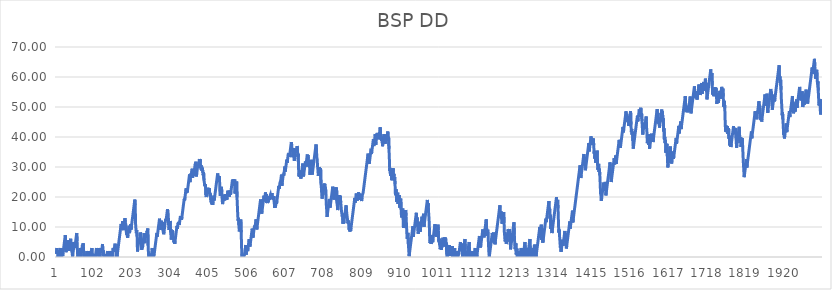
| Category | BSP DD |
|---|---|
| 0 | 1 |
| 1 | 2 |
| 2 | 3 |
| 3 | 1.15 |
| 4 | 2.15 |
| 5 | 0 |
| 6 | 0 |
| 7 | 1 |
| 8 | 0 |
| 9 | 1 |
| 10 | 2 |
| 11 | 3 |
| 12 | 1.41 |
| 13 | 0 |
| 14 | 1 |
| 15 | 2 |
| 16 | 3 |
| 17 | 0.31 |
| 18 | 1.31 |
| 19 | 2.31 |
| 20 | 3.31 |
| 21 | 4.31 |
| 22 | 5.31 |
| 23 | 6.31 |
| 24 | 7.31 |
| 25 | 4.64 |
| 26 | 1.6 |
| 27 | 2.6 |
| 28 | 3.6 |
| 29 | 4.6 |
| 30 | 5.6 |
| 31 | 4.37 |
| 32 | 2.92 |
| 33 | 3.92 |
| 34 | 2.1 |
| 35 | 3.1 |
| 36 | 4.1 |
| 37 | 5.1 |
| 38 | 6.1 |
| 39 | 2.9 |
| 40 | 3.9 |
| 41 | 4.9 |
| 42 | 1.47 |
| 43 | 0 |
| 44 | 1 |
| 45 | 2 |
| 46 | 3 |
| 47 | 4 |
| 48 | 5 |
| 49 | 3 |
| 50 | 4 |
| 51 | 5 |
| 52 | 6 |
| 53 | 7 |
| 54 | 8 |
| 55 | 5.35 |
| 56 | 1.64 |
| 57 | 0.07 |
| 58 | 1.07 |
| 59 | 2.07 |
| 60 | 0 |
| 61 | 1 |
| 62 | 2 |
| 63 | 3 |
| 64 | 1.67 |
| 65 | 0 |
| 66 | 1 |
| 67 | 2 |
| 68 | 3 |
| 69 | 4 |
| 70 | 3.55 |
| 71 | 4.55 |
| 72 | 2.29 |
| 73 | 0 |
| 74 | 0 |
| 75 | 0 |
| 76 | 0 |
| 77 | 1 |
| 78 | 0 |
| 79 | 0 |
| 80 | 1 |
| 81 | 2 |
| 82 | 0 |
| 83 | 0 |
| 84 | 1 |
| 85 | 2 |
| 86 | 0.72 |
| 87 | 0 |
| 88 | 0 |
| 89 | 1 |
| 90 | 0 |
| 91 | 0 |
| 92 | 1 |
| 93 | 2 |
| 94 | 3 |
| 95 | 0 |
| 96 | 0 |
| 97 | 0 |
| 98 | 0 |
| 99 | 0 |
| 100 | 1 |
| 101 | 0 |
| 102 | 1 |
| 103 | 0 |
| 104 | 1 |
| 105 | 2 |
| 106 | 3 |
| 107 | 1.53 |
| 108 | 0.18 |
| 109 | 0 |
| 110 | 1 |
| 111 | 2 |
| 112 | 3 |
| 113 | 0.79 |
| 114 | 1.79 |
| 115 | 0 |
| 116 | 1 |
| 117 | 2 |
| 118 | 3 |
| 119 | 1.33 |
| 120 | 2.33 |
| 121 | 3.33 |
| 122 | 4.33 |
| 123 | 1.19 |
| 124 | 2.19 |
| 125 | 0.24 |
| 126 | 0 |
| 127 | 0 |
| 128 | 0 |
| 129 | 0 |
| 130 | 1 |
| 131 | 0 |
| 132 | 1 |
| 133 | 0 |
| 134 | 1 |
| 135 | 2 |
| 136 | 0.4 |
| 137 | 0 |
| 138 | 0 |
| 139 | 1 |
| 140 | 0 |
| 141 | 1 |
| 142 | 2 |
| 143 | 0 |
| 144 | 0 |
| 145 | 1 |
| 146 | 2 |
| 147 | 0 |
| 148 | 1 |
| 149 | 2 |
| 150 | 3 |
| 151 | 1.76 |
| 152 | 2.76 |
| 153 | 2.44 |
| 154 | 3.44 |
| 155 | 4.44 |
| 156 | 3.15 |
| 157 | 1.98 |
| 158 | 0.03 |
| 159 | 1.03 |
| 160 | 0 |
| 161 | 1 |
| 162 | 2 |
| 163 | 3 |
| 164 | 4 |
| 165 | 5 |
| 166 | 6 |
| 167 | 7 |
| 168 | 8 |
| 169 | 9 |
| 170 | 10 |
| 171 | 11 |
| 172 | 8.97 |
| 173 | 9.97 |
| 174 | 10.97 |
| 175 | 11.97 |
| 176 | 9.91 |
| 177 | 8.95 |
| 178 | 9.95 |
| 179 | 10.95 |
| 180 | 11.95 |
| 181 | 12.95 |
| 182 | 11.55 |
| 183 | 11.25 |
| 184 | 10.39 |
| 185 | 7.46 |
| 186 | 8.46 |
| 187 | 7.21 |
| 188 | 6.42 |
| 189 | 7.42 |
| 190 | 8.42 |
| 191 | 9.42 |
| 192 | 10.42 |
| 193 | 7.97 |
| 194 | 8.97 |
| 195 | 9.97 |
| 196 | 10.97 |
| 197 | 9.13 |
| 198 | 10.13 |
| 199 | 11.13 |
| 200 | 12.13 |
| 201 | 13.13 |
| 202 | 14.13 |
| 203 | 15.13 |
| 204 | 16.13 |
| 205 | 17.13 |
| 206 | 18.13 |
| 207 | 19.13 |
| 208 | 17.41 |
| 209 | 11.03 |
| 210 | 9.23 |
| 211 | 7.93 |
| 212 | 8.93 |
| 213 | 6.92 |
| 214 | 1.82 |
| 215 | 2.82 |
| 216 | 3.82 |
| 217 | 4.82 |
| 218 | 5.82 |
| 219 | 5.17 |
| 220 | 6.17 |
| 221 | 7.17 |
| 222 | 8.17 |
| 223 | 7.64 |
| 224 | 5.45 |
| 225 | 2.36 |
| 226 | 3.36 |
| 227 | 2.93 |
| 228 | 3.93 |
| 229 | 4.93 |
| 230 | 5.93 |
| 231 | 6.93 |
| 232 | 7.93 |
| 233 | 4.62 |
| 234 | 5.62 |
| 235 | 6.62 |
| 236 | 7.62 |
| 237 | 6.81 |
| 238 | 7.81 |
| 239 | 8.81 |
| 240 | 8.47 |
| 241 | 9.47 |
| 242 | 3.83 |
| 243 | 0.92 |
| 244 | 0 |
| 245 | 0 |
| 246 | 1 |
| 247 | 0 |
| 248 | 0 |
| 249 | 1 |
| 250 | 0 |
| 251 | 1 |
| 252 | 2 |
| 253 | 3 |
| 254 | 0 |
| 255 | 1 |
| 256 | 0 |
| 257 | 0 |
| 258 | 1 |
| 259 | 2 |
| 260 | 3 |
| 261 | 4 |
| 262 | 5 |
| 263 | 6 |
| 264 | 7 |
| 265 | 8 |
| 266 | 6.77 |
| 267 | 7.77 |
| 268 | 8.77 |
| 269 | 9.77 |
| 270 | 10.77 |
| 271 | 11.77 |
| 272 | 12.77 |
| 273 | 11.6 |
| 274 | 9.1 |
| 275 | 10.1 |
| 276 | 11.1 |
| 277 | 12.1 |
| 278 | 9.65 |
| 279 | 10.65 |
| 280 | 11.65 |
| 281 | 8.96 |
| 282 | 8.63 |
| 283 | 7.58 |
| 284 | 8.58 |
| 285 | 9.58 |
| 286 | 10.58 |
| 287 | 11.58 |
| 288 | 12.58 |
| 289 | 11.96 |
| 290 | 12.96 |
| 291 | 13.96 |
| 292 | 14.96 |
| 293 | 15.96 |
| 294 | 15.05 |
| 295 | 14.23 |
| 296 | 10.53 |
| 297 | 9.03 |
| 298 | 10.03 |
| 299 | 11.03 |
| 300 | 12.03 |
| 301 | 8.26 |
| 302 | 9.26 |
| 303 | 5.83 |
| 304 | 6.83 |
| 305 | 7.83 |
| 306 | 8.83 |
| 307 | 8.36 |
| 308 | 6.65 |
| 309 | 5.85 |
| 310 | 4.83 |
| 311 | 5.83 |
| 312 | 4.38 |
| 313 | 5.38 |
| 314 | 6.38 |
| 315 | 7.38 |
| 316 | 8.38 |
| 317 | 9.38 |
| 318 | 10.38 |
| 319 | 9.44 |
| 320 | 10.44 |
| 321 | 11.44 |
| 322 | 10.73 |
| 323 | 11.73 |
| 324 | 10.68 |
| 325 | 11.68 |
| 326 | 12.68 |
| 327 | 13.68 |
| 328 | 12.53 |
| 329 | 13.53 |
| 330 | 12.38 |
| 331 | 13.38 |
| 332 | 14.38 |
| 333 | 15.38 |
| 334 | 16.38 |
| 335 | 17.38 |
| 336 | 18.38 |
| 337 | 19.38 |
| 338 | 18.89 |
| 339 | 19.89 |
| 340 | 20.89 |
| 341 | 21.89 |
| 342 | 22.89 |
| 343 | 21.32 |
| 344 | 22.32 |
| 345 | 21.51 |
| 346 | 22.51 |
| 347 | 23.51 |
| 348 | 24.51 |
| 349 | 25.51 |
| 350 | 26.51 |
| 351 | 27.51 |
| 352 | 24.96 |
| 353 | 25.96 |
| 354 | 26.96 |
| 355 | 27.96 |
| 356 | 27.45 |
| 357 | 28.45 |
| 358 | 29.45 |
| 359 | 26.42 |
| 360 | 27.42 |
| 361 | 28.42 |
| 362 | 27.15 |
| 363 | 28.15 |
| 364 | 29.15 |
| 365 | 30.15 |
| 366 | 31.15 |
| 367 | 30.74 |
| 368 | 31.74 |
| 369 | 26.87 |
| 370 | 27.87 |
| 371 | 28.87 |
| 372 | 29.87 |
| 373 | 30.87 |
| 374 | 29.67 |
| 375 | 30.67 |
| 376 | 31.67 |
| 377 | 32.67 |
| 378 | 31.58 |
| 379 | 32.58 |
| 380 | 29.61 |
| 381 | 30.61 |
| 382 | 29.1 |
| 383 | 30.1 |
| 384 | 28.73 |
| 385 | 29.73 |
| 386 | 28.15 |
| 387 | 27.2 |
| 388 | 28.2 |
| 389 | 25.57 |
| 390 | 24.84 |
| 391 | 23.55 |
| 392 | 23.26 |
| 393 | 24.26 |
| 394 | 20.71 |
| 395 | 19.99 |
| 396 | 20.99 |
| 397 | 21.99 |
| 398 | 22.99 |
| 399 | 22.06 |
| 400 | 23.06 |
| 401 | 20.97 |
| 402 | 21.97 |
| 403 | 22.97 |
| 404 | 21.54 |
| 405 | 20.17 |
| 406 | 21.17 |
| 407 | 18.99 |
| 408 | 18.18 |
| 409 | 19.18 |
| 410 | 17.52 |
| 411 | 18.52 |
| 412 | 17.42 |
| 413 | 18.42 |
| 414 | 19.42 |
| 415 | 20.42 |
| 416 | 18.86 |
| 417 | 19.86 |
| 418 | 20.86 |
| 419 | 21.86 |
| 420 | 22.86 |
| 421 | 23.86 |
| 422 | 24.86 |
| 423 | 25.86 |
| 424 | 26.86 |
| 425 | 27.86 |
| 426 | 26.02 |
| 427 | 27.02 |
| 428 | 25.98 |
| 429 | 26.98 |
| 430 | 25.92 |
| 431 | 21.31 |
| 432 | 20.41 |
| 433 | 21.41 |
| 434 | 22.41 |
| 435 | 23.41 |
| 436 | 21.52 |
| 437 | 18.97 |
| 438 | 17.63 |
| 439 | 18.63 |
| 440 | 19.63 |
| 441 | 18.77 |
| 442 | 19.77 |
| 443 | 20.77 |
| 444 | 18.93 |
| 445 | 19.93 |
| 446 | 20.93 |
| 447 | 19.36 |
| 448 | 20.36 |
| 449 | 19.09 |
| 450 | 20.09 |
| 451 | 21.09 |
| 452 | 22.09 |
| 453 | 20.11 |
| 454 | 21.11 |
| 455 | 22.11 |
| 456 | 20.13 |
| 457 | 21.13 |
| 458 | 22.13 |
| 459 | 20.78 |
| 460 | 21.78 |
| 461 | 22.78 |
| 462 | 23.78 |
| 463 | 24.78 |
| 464 | 25.78 |
| 465 | 23.83 |
| 466 | 24.83 |
| 467 | 25.83 |
| 468 | 23.86 |
| 469 | 24.86 |
| 470 | 25.86 |
| 471 | 21.18 |
| 472 | 22.18 |
| 473 | 23.18 |
| 474 | 24.18 |
| 475 | 25.18 |
| 476 | 19.91 |
| 477 | 16.87 |
| 478 | 13.73 |
| 479 | 12.03 |
| 480 | 13.03 |
| 481 | 10.53 |
| 482 | 8.52 |
| 483 | 9.52 |
| 484 | 10.52 |
| 485 | 11.52 |
| 486 | 12.52 |
| 487 | 8.21 |
| 488 | 3.31 |
| 489 | 0 |
| 490 | 1 |
| 491 | 0 |
| 492 | 1 |
| 493 | 0 |
| 494 | 0 |
| 495 | 0 |
| 496 | 1 |
| 497 | 2 |
| 498 | 3 |
| 499 | 4 |
| 500 | 0.82 |
| 501 | 1.82 |
| 502 | 2.82 |
| 503 | 3.82 |
| 504 | 1.96 |
| 505 | 2.96 |
| 506 | 3.96 |
| 507 | 4.96 |
| 508 | 5.96 |
| 509 | 4.14 |
| 510 | 3.47 |
| 511 | 4.47 |
| 512 | 5.47 |
| 513 | 6.47 |
| 514 | 7.47 |
| 515 | 8.47 |
| 516 | 9.47 |
| 517 | 8.38 |
| 518 | 6.44 |
| 519 | 7.44 |
| 520 | 8.44 |
| 521 | 9.44 |
| 522 | 10.44 |
| 523 | 9.56 |
| 524 | 10.56 |
| 525 | 11.56 |
| 526 | 12.56 |
| 527 | 11.75 |
| 528 | 9.18 |
| 529 | 10.18 |
| 530 | 11.18 |
| 531 | 12.18 |
| 532 | 13.18 |
| 533 | 14.18 |
| 534 | 15.18 |
| 535 | 16.18 |
| 536 | 17.18 |
| 537 | 18.18 |
| 538 | 19.18 |
| 539 | 17.94 |
| 540 | 15.11 |
| 541 | 14.44 |
| 542 | 15.44 |
| 543 | 16.44 |
| 544 | 17.44 |
| 545 | 18.44 |
| 546 | 19.44 |
| 547 | 20.44 |
| 548 | 18.55 |
| 549 | 19.55 |
| 550 | 20.55 |
| 551 | 21.55 |
| 552 | 20.01 |
| 553 | 21.01 |
| 554 | 18.07 |
| 555 | 19.07 |
| 556 | 17.97 |
| 557 | 18.97 |
| 558 | 18.24 |
| 559 | 19.24 |
| 560 | 20.24 |
| 561 | 19.01 |
| 562 | 20.01 |
| 563 | 19.74 |
| 564 | 20.74 |
| 565 | 20.1 |
| 566 | 21.1 |
| 567 | 20.28 |
| 568 | 21.28 |
| 569 | 19.24 |
| 570 | 20.24 |
| 571 | 20.05 |
| 572 | 19.24 |
| 573 | 20.24 |
| 574 | 18.32 |
| 575 | 16.35 |
| 576 | 17.35 |
| 577 | 16.53 |
| 578 | 17.53 |
| 579 | 18.53 |
| 580 | 17.69 |
| 581 | 18.69 |
| 582 | 19.69 |
| 583 | 20.69 |
| 584 | 21.69 |
| 585 | 22.69 |
| 586 | 23.69 |
| 587 | 22.69 |
| 588 | 23.69 |
| 589 | 24.69 |
| 590 | 24.46 |
| 591 | 25.46 |
| 592 | 26.46 |
| 593 | 27.46 |
| 594 | 23.74 |
| 595 | 24.74 |
| 596 | 25.74 |
| 597 | 26.74 |
| 598 | 27.74 |
| 599 | 27.16 |
| 600 | 28.16 |
| 601 | 29.16 |
| 602 | 30.16 |
| 603 | 28.45 |
| 604 | 29.45 |
| 605 | 30.45 |
| 606 | 31.45 |
| 607 | 32.45 |
| 608 | 31.4 |
| 609 | 32.4 |
| 610 | 33.4 |
| 611 | 34.4 |
| 612 | 33.67 |
| 613 | 34.67 |
| 614 | 33.32 |
| 615 | 34.32 |
| 616 | 35.32 |
| 617 | 36.32 |
| 618 | 37.32 |
| 619 | 38.32 |
| 620 | 37.32 |
| 621 | 35.32 |
| 622 | 36.32 |
| 623 | 33.28 |
| 624 | 34.28 |
| 625 | 35.28 |
| 626 | 36.28 |
| 627 | 32.07 |
| 628 | 33.07 |
| 629 | 34.07 |
| 630 | 35.07 |
| 631 | 36.07 |
| 632 | 34.95 |
| 633 | 35.95 |
| 634 | 36.95 |
| 635 | 36.46 |
| 636 | 33.43 |
| 637 | 34.43 |
| 638 | 29.54 |
| 639 | 26.85 |
| 640 | 27.85 |
| 641 | 26.8 |
| 642 | 27.8 |
| 643 | 28.8 |
| 644 | 26.15 |
| 645 | 27.15 |
| 646 | 28.15 |
| 647 | 29.15 |
| 648 | 30.15 |
| 649 | 31.15 |
| 650 | 28.11 |
| 651 | 26.84 |
| 652 | 27.84 |
| 653 | 28.84 |
| 654 | 29.84 |
| 655 | 30.84 |
| 656 | 31.84 |
| 657 | 30.17 |
| 658 | 31.17 |
| 659 | 32.17 |
| 660 | 33.17 |
| 661 | 34.17 |
| 662 | 32.98 |
| 663 | 33.98 |
| 664 | 30.2 |
| 665 | 31.2 |
| 666 | 32.2 |
| 667 | 30.1 |
| 668 | 27.39 |
| 669 | 28.39 |
| 670 | 29.39 |
| 671 | 30.39 |
| 672 | 31.39 |
| 673 | 32.39 |
| 674 | 27.51 |
| 675 | 28.51 |
| 676 | 29.51 |
| 677 | 30.51 |
| 678 | 31.51 |
| 679 | 32.51 |
| 680 | 33.51 |
| 681 | 34.51 |
| 682 | 35.51 |
| 683 | 36.51 |
| 684 | 37.51 |
| 685 | 36.19 |
| 686 | 33.19 |
| 687 | 32.66 |
| 688 | 30.24 |
| 689 | 28.98 |
| 690 | 27.02 |
| 691 | 28.02 |
| 692 | 29.02 |
| 693 | 30.02 |
| 694 | 27.66 |
| 695 | 28.66 |
| 696 | 29.66 |
| 697 | 24.49 |
| 698 | 23.19 |
| 699 | 20.89 |
| 700 | 19.45 |
| 701 | 20.45 |
| 702 | 21.45 |
| 703 | 22.45 |
| 704 | 23.45 |
| 705 | 24.45 |
| 706 | 23.4 |
| 707 | 24.4 |
| 708 | 22.15 |
| 709 | 23.15 |
| 710 | 20.55 |
| 711 | 17.66 |
| 712 | 15.72 |
| 713 | 13.37 |
| 714 | 14.37 |
| 715 | 15.37 |
| 716 | 16.37 |
| 717 | 17.37 |
| 718 | 18.37 |
| 719 | 19.37 |
| 720 | 17.7 |
| 721 | 16.45 |
| 722 | 17.45 |
| 723 | 18.45 |
| 724 | 19.45 |
| 725 | 20.45 |
| 726 | 21.45 |
| 727 | 22.45 |
| 728 | 23.45 |
| 729 | 20.51 |
| 730 | 21.51 |
| 731 | 19.16 |
| 732 | 20.16 |
| 733 | 21.16 |
| 734 | 22.16 |
| 735 | 23.16 |
| 736 | 21.17 |
| 737 | 22.17 |
| 738 | 23.17 |
| 739 | 18.07 |
| 740 | 17.19 |
| 741 | 15.64 |
| 742 | 16.64 |
| 743 | 17.64 |
| 744 | 18.64 |
| 745 | 19.64 |
| 746 | 20.64 |
| 747 | 19.41 |
| 748 | 20.41 |
| 749 | 18.16 |
| 750 | 16.78 |
| 751 | 15.31 |
| 752 | 15.06 |
| 753 | 13.47 |
| 754 | 14.47 |
| 755 | 11.13 |
| 756 | 12.13 |
| 757 | 11.23 |
| 758 | 12.23 |
| 759 | 13.23 |
| 760 | 14.23 |
| 761 | 15.23 |
| 762 | 16.23 |
| 763 | 17.23 |
| 764 | 15.86 |
| 765 | 14.39 |
| 766 | 13.37 |
| 767 | 12.33 |
| 768 | 11.17 |
| 769 | 12.17 |
| 770 | 10.92 |
| 771 | 9.08 |
| 772 | 10.08 |
| 773 | 8.5 |
| 774 | 9.5 |
| 775 | 8.67 |
| 776 | 9.67 |
| 777 | 10.67 |
| 778 | 11.67 |
| 779 | 12.67 |
| 780 | 13.67 |
| 781 | 14.67 |
| 782 | 15.67 |
| 783 | 16.67 |
| 784 | 17.67 |
| 785 | 18.67 |
| 786 | 19.67 |
| 787 | 18.16 |
| 788 | 19.16 |
| 789 | 20.16 |
| 790 | 21.16 |
| 791 | 19.75 |
| 792 | 18.73 |
| 793 | 19.73 |
| 794 | 19.57 |
| 795 | 20.57 |
| 796 | 21.57 |
| 797 | 20.13 |
| 798 | 21.13 |
| 799 | 19.02 |
| 800 | 20.02 |
| 801 | 21.02 |
| 802 | 19.6 |
| 803 | 20.6 |
| 804 | 18.65 |
| 805 | 19.65 |
| 806 | 20.65 |
| 807 | 20.46 |
| 808 | 21.46 |
| 809 | 22.46 |
| 810 | 23.46 |
| 811 | 24.46 |
| 812 | 25.46 |
| 813 | 26.46 |
| 814 | 27.46 |
| 815 | 28.46 |
| 816 | 29.46 |
| 817 | 30.46 |
| 818 | 31.46 |
| 819 | 32.46 |
| 820 | 33.46 |
| 821 | 34.46 |
| 822 | 32.93 |
| 823 | 32.05 |
| 824 | 31.08 |
| 825 | 32.08 |
| 826 | 33.08 |
| 827 | 34.08 |
| 828 | 35.08 |
| 829 | 36.08 |
| 830 | 34.34 |
| 831 | 35.34 |
| 832 | 36.34 |
| 833 | 37.34 |
| 834 | 38.34 |
| 835 | 39.34 |
| 836 | 36.99 |
| 837 | 37.99 |
| 838 | 38.99 |
| 839 | 39.99 |
| 840 | 40.99 |
| 841 | 37.36 |
| 842 | 38.36 |
| 843 | 39.36 |
| 844 | 40.36 |
| 845 | 41.36 |
| 846 | 40.43 |
| 847 | 40.26 |
| 848 | 41.26 |
| 849 | 39.25 |
| 850 | 40.25 |
| 851 | 41.25 |
| 852 | 42.25 |
| 853 | 43.25 |
| 854 | 40.97 |
| 855 | 39.17 |
| 856 | 40.17 |
| 857 | 38.73 |
| 858 | 39.73 |
| 859 | 36.94 |
| 860 | 37.94 |
| 861 | 38.94 |
| 862 | 39.94 |
| 863 | 40.94 |
| 864 | 39.04 |
| 865 | 40.04 |
| 866 | 37.78 |
| 867 | 38.78 |
| 868 | 39.78 |
| 869 | 40.78 |
| 870 | 38.83 |
| 871 | 39.83 |
| 872 | 40.83 |
| 873 | 41.83 |
| 874 | 39.07 |
| 875 | 40.07 |
| 876 | 36.05 |
| 877 | 32.82 |
| 878 | 28.69 |
| 879 | 29.69 |
| 880 | 27.05 |
| 881 | 28.05 |
| 882 | 29.05 |
| 883 | 25.6 |
| 884 | 26.6 |
| 885 | 27.6 |
| 886 | 28.6 |
| 887 | 29.6 |
| 888 | 26.73 |
| 889 | 27.73 |
| 890 | 25.67 |
| 891 | 26.67 |
| 892 | 24.29 |
| 893 | 20.57 |
| 894 | 21.57 |
| 895 | 22.57 |
| 896 | 18.45 |
| 897 | 19.45 |
| 898 | 20.45 |
| 899 | 21.45 |
| 900 | 17.67 |
| 901 | 18.67 |
| 902 | 19.67 |
| 903 | 20.67 |
| 904 | 16.48 |
| 905 | 17.48 |
| 906 | 18.48 |
| 907 | 19.48 |
| 908 | 15.84 |
| 909 | 13.19 |
| 910 | 14.19 |
| 911 | 15.19 |
| 912 | 16.19 |
| 913 | 13.31 |
| 914 | 9.68 |
| 915 | 10.68 |
| 916 | 11.68 |
| 917 | 12.68 |
| 918 | 13.68 |
| 919 | 14.68 |
| 920 | 15.68 |
| 921 | 13.72 |
| 922 | 10.94 |
| 923 | 7.9 |
| 924 | 6.04 |
| 925 | 7.04 |
| 926 | 8.04 |
| 927 | 4.42 |
| 928 | 2.41 |
| 929 | 0.25 |
| 930 | 1.25 |
| 931 | 2.25 |
| 932 | 3.25 |
| 933 | 4.25 |
| 934 | 5.25 |
| 935 | 6.25 |
| 936 | 7.25 |
| 937 | 8.25 |
| 938 | 9.25 |
| 939 | 10.25 |
| 940 | 6.73 |
| 941 | 7.73 |
| 942 | 8.73 |
| 943 | 9.73 |
| 944 | 10.73 |
| 945 | 11.73 |
| 946 | 12.73 |
| 947 | 13.73 |
| 948 | 14.73 |
| 949 | 12.21 |
| 950 | 13.21 |
| 951 | 10.2 |
| 952 | 11.2 |
| 953 | 7.77 |
| 954 | 8.77 |
| 955 | 9.77 |
| 956 | 10.77 |
| 957 | 11.77 |
| 958 | 8.44 |
| 959 | 9.44 |
| 960 | 10.44 |
| 961 | 11.44 |
| 962 | 12.44 |
| 963 | 13.44 |
| 964 | 11.41 |
| 965 | 12.41 |
| 966 | 13.41 |
| 967 | 14.41 |
| 968 | 10.03 |
| 969 | 11.03 |
| 970 | 12.03 |
| 971 | 13.03 |
| 972 | 14.03 |
| 973 | 15.03 |
| 974 | 16.03 |
| 975 | 17.03 |
| 976 | 18.03 |
| 977 | 19.03 |
| 978 | 16.95 |
| 979 | 17.95 |
| 980 | 15.51 |
| 981 | 13.57 |
| 982 | 11.37 |
| 983 | 6.98 |
| 984 | 4.65 |
| 985 | 5.65 |
| 986 | 6.65 |
| 987 | 4.35 |
| 988 | 5.35 |
| 989 | 6.35 |
| 990 | 7.35 |
| 991 | 4.94 |
| 992 | 5.94 |
| 993 | 6.94 |
| 994 | 7.94 |
| 995 | 8.94 |
| 996 | 9.94 |
| 997 | 10.94 |
| 998 | 7.75 |
| 999 | 8.75 |
| 1000 | 9.75 |
| 1001 | 6.78 |
| 1002 | 7.78 |
| 1003 | 8.78 |
| 1004 | 9.78 |
| 1005 | 10.78 |
| 1006 | 8.86 |
| 1007 | 5.14 |
| 1008 | 6.14 |
| 1009 | 4.13 |
| 1010 | 5.13 |
| 1011 | 2.63 |
| 1012 | 3.63 |
| 1013 | 4.63 |
| 1014 | 2.43 |
| 1015 | 3.43 |
| 1016 | 4.43 |
| 1017 | 5.43 |
| 1018 | 6.43 |
| 1019 | 3.49 |
| 1020 | 4.49 |
| 1021 | 5.49 |
| 1022 | 6.49 |
| 1023 | 4.47 |
| 1024 | 5.47 |
| 1025 | 6.47 |
| 1026 | 3.82 |
| 1027 | 4.82 |
| 1028 | 0.9 |
| 1029 | 0 |
| 1030 | 0 |
| 1031 | 0 |
| 1032 | 1 |
| 1033 | 2 |
| 1034 | 3 |
| 1035 | 4 |
| 1036 | 0.37 |
| 1037 | 1.37 |
| 1038 | 2.37 |
| 1039 | 3.37 |
| 1040 | 0.65 |
| 1041 | 1.65 |
| 1042 | 2.65 |
| 1043 | 3.65 |
| 1044 | 0 |
| 1045 | 1 |
| 1046 | 0 |
| 1047 | 1 |
| 1048 | 2 |
| 1049 | 3 |
| 1050 | 0 |
| 1051 | 1 |
| 1052 | 2 |
| 1053 | 0 |
| 1054 | 1 |
| 1055 | 2 |
| 1056 | 0.42 |
| 1057 | 0 |
| 1058 | 0 |
| 1059 | 0 |
| 1060 | 1 |
| 1061 | 2 |
| 1062 | 3 |
| 1063 | 4 |
| 1064 | 5 |
| 1065 | 2.5 |
| 1066 | 3.5 |
| 1067 | 4.5 |
| 1068 | 1.95 |
| 1069 | 2.95 |
| 1070 | 0 |
| 1071 | 1 |
| 1072 | 2 |
| 1073 | 3 |
| 1074 | 4 |
| 1075 | 5 |
| 1076 | 6 |
| 1077 | 2.46 |
| 1078 | 0 |
| 1079 | 0 |
| 1080 | 0 |
| 1081 | 1 |
| 1082 | 0 |
| 1083 | 1 |
| 1084 | 2 |
| 1085 | 3 |
| 1086 | 4 |
| 1087 | 5 |
| 1088 | 2.47 |
| 1089 | 0 |
| 1090 | 1 |
| 1091 | 0 |
| 1092 | 0 |
| 1093 | 1 |
| 1094 | 2 |
| 1095 | 0 |
| 1096 | 1 |
| 1097 | 2 |
| 1098 | 0 |
| 1099 | 1 |
| 1100 | 0 |
| 1101 | 1 |
| 1102 | 2 |
| 1103 | 3 |
| 1104 | 0 |
| 1105 | 1 |
| 1106 | 2 |
| 1107 | 0 |
| 1108 | 1 |
| 1109 | 2 |
| 1110 | 3 |
| 1111 | 4 |
| 1112 | 5 |
| 1113 | 6 |
| 1114 | 7 |
| 1115 | 4.67 |
| 1116 | 5.67 |
| 1117 | 3.19 |
| 1118 | 4.19 |
| 1119 | 5.19 |
| 1120 | 6.19 |
| 1121 | 7.19 |
| 1122 | 8.19 |
| 1123 | 9.19 |
| 1124 | 7.23 |
| 1125 | 8.23 |
| 1126 | 6.55 |
| 1127 | 7.55 |
| 1128 | 8.55 |
| 1129 | 9.55 |
| 1130 | 10.55 |
| 1131 | 11.55 |
| 1132 | 12.55 |
| 1133 | 9.85 |
| 1134 | 7.11 |
| 1135 | 8.11 |
| 1136 | 9.11 |
| 1137 | 7.05 |
| 1138 | 4.13 |
| 1139 | 1.58 |
| 1140 | 0 |
| 1141 | 1 |
| 1142 | 2 |
| 1143 | 3 |
| 1144 | 4 |
| 1145 | 5 |
| 1146 | 6 |
| 1147 | 7 |
| 1148 | 8 |
| 1149 | 6.19 |
| 1150 | 7.19 |
| 1151 | 8.19 |
| 1152 | 4.86 |
| 1153 | 5.86 |
| 1154 | 6.86 |
| 1155 | 4.24 |
| 1156 | 5.24 |
| 1157 | 6.24 |
| 1158 | 7.24 |
| 1159 | 8.24 |
| 1160 | 9.24 |
| 1161 | 10.24 |
| 1162 | 11.24 |
| 1163 | 12.24 |
| 1164 | 13.24 |
| 1165 | 14.24 |
| 1166 | 15.24 |
| 1167 | 16.24 |
| 1168 | 17.24 |
| 1169 | 13.22 |
| 1170 | 14.22 |
| 1171 | 15.22 |
| 1172 | 12.6 |
| 1173 | 13.6 |
| 1174 | 11.01 |
| 1175 | 12.01 |
| 1176 | 13.01 |
| 1177 | 14.01 |
| 1178 | 15.01 |
| 1179 | 11.36 |
| 1180 | 7.24 |
| 1181 | 8.24 |
| 1182 | 5.21 |
| 1183 | 6.21 |
| 1184 | 7.21 |
| 1185 | 4.32 |
| 1186 | 5.32 |
| 1187 | 6.32 |
| 1188 | 7.32 |
| 1189 | 8.32 |
| 1190 | 9.32 |
| 1191 | 7.36 |
| 1192 | 8.36 |
| 1193 | 9.36 |
| 1194 | 5.15 |
| 1195 | 6.15 |
| 1196 | 2.56 |
| 1197 | 3.56 |
| 1198 | 4.56 |
| 1199 | 5.56 |
| 1200 | 6.56 |
| 1201 | 7.56 |
| 1202 | 8.56 |
| 1203 | 9.56 |
| 1204 | 10.56 |
| 1205 | 11.56 |
| 1206 | 7.44 |
| 1207 | 4.51 |
| 1208 | 2.61 |
| 1209 | 3.61 |
| 1210 | 4.61 |
| 1211 | 0.82 |
| 1212 | 1.82 |
| 1213 | 2.82 |
| 1214 | 0 |
| 1215 | 1 |
| 1216 | 2 |
| 1217 | 0 |
| 1218 | 0 |
| 1219 | 0 |
| 1220 | 1 |
| 1221 | 0 |
| 1222 | 1 |
| 1223 | 2 |
| 1224 | 3 |
| 1225 | 0 |
| 1226 | 1 |
| 1227 | 2 |
| 1228 | 3 |
| 1229 | 0 |
| 1230 | 1 |
| 1231 | 2 |
| 1232 | 3 |
| 1233 | 4 |
| 1234 | 5 |
| 1235 | 2.16 |
| 1236 | 0 |
| 1237 | 1 |
| 1238 | 2 |
| 1239 | 3 |
| 1240 | 0.95 |
| 1241 | 0 |
| 1242 | 1 |
| 1243 | 2 |
| 1244 | 3 |
| 1245 | 4 |
| 1246 | 5 |
| 1247 | 6 |
| 1248 | 1.98 |
| 1249 | 0.06 |
| 1250 | 1.06 |
| 1251 | 2.06 |
| 1252 | 0 |
| 1253 | 1 |
| 1254 | 2 |
| 1255 | 3 |
| 1256 | 1.13 |
| 1257 | 2.13 |
| 1258 | 3.13 |
| 1259 | 4.13 |
| 1260 | 0 |
| 1261 | 0 |
| 1262 | 1 |
| 1263 | 0 |
| 1264 | 1 |
| 1265 | 2 |
| 1266 | 3 |
| 1267 | 4 |
| 1268 | 5 |
| 1269 | 6 |
| 1270 | 7 |
| 1271 | 8 |
| 1272 | 9 |
| 1273 | 10 |
| 1274 | 7.79 |
| 1275 | 8.79 |
| 1276 | 9.79 |
| 1277 | 10.79 |
| 1278 | 5.69 |
| 1279 | 6.69 |
| 1280 | 7.69 |
| 1281 | 4.8 |
| 1282 | 5.8 |
| 1283 | 6.8 |
| 1284 | 7.8 |
| 1285 | 8.8 |
| 1286 | 9.8 |
| 1287 | 10.8 |
| 1288 | 11.8 |
| 1289 | 12.8 |
| 1290 | 11.65 |
| 1291 | 12.65 |
| 1292 | 13.65 |
| 1293 | 14.65 |
| 1294 | 15.65 |
| 1295 | 16.65 |
| 1296 | 17.65 |
| 1297 | 18.65 |
| 1298 | 15.04 |
| 1299 | 16.04 |
| 1300 | 12.88 |
| 1301 | 13.88 |
| 1302 | 9.4 |
| 1303 | 10.4 |
| 1304 | 11.4 |
| 1305 | 7.97 |
| 1306 | 8.97 |
| 1307 | 9.97 |
| 1308 | 10.97 |
| 1309 | 11.97 |
| 1310 | 12.97 |
| 1311 | 13.97 |
| 1312 | 14.97 |
| 1313 | 15.97 |
| 1314 | 16.97 |
| 1315 | 17.97 |
| 1316 | 18.97 |
| 1317 | 19.97 |
| 1318 | 17.03 |
| 1319 | 18.03 |
| 1320 | 19.03 |
| 1321 | 16.19 |
| 1322 | 12.17 |
| 1323 | 8.16 |
| 1324 | 9.16 |
| 1325 | 7.07 |
| 1326 | 5.35 |
| 1327 | 3.19 |
| 1328 | 4.19 |
| 1329 | 1.75 |
| 1330 | 2.75 |
| 1331 | 3.75 |
| 1332 | 4.75 |
| 1333 | 5.75 |
| 1334 | 3.69 |
| 1335 | 4.69 |
| 1336 | 5.69 |
| 1337 | 6.69 |
| 1338 | 7.69 |
| 1339 | 8.69 |
| 1340 | 6.85 |
| 1341 | 7.85 |
| 1342 | 5.58 |
| 1343 | 2.84 |
| 1344 | 3.84 |
| 1345 | 4.84 |
| 1346 | 5.84 |
| 1347 | 6.84 |
| 1348 | 7.84 |
| 1349 | 8.84 |
| 1350 | 9.84 |
| 1351 | 10.84 |
| 1352 | 11.84 |
| 1353 | 9.46 |
| 1354 | 10.46 |
| 1355 | 11.46 |
| 1356 | 12.46 |
| 1357 | 13.46 |
| 1358 | 14.46 |
| 1359 | 15.46 |
| 1360 | 11.54 |
| 1361 | 12.54 |
| 1362 | 13.54 |
| 1363 | 14.54 |
| 1364 | 15.54 |
| 1365 | 16.54 |
| 1366 | 17.54 |
| 1367 | 18.54 |
| 1368 | 19.54 |
| 1369 | 20.54 |
| 1370 | 21.54 |
| 1371 | 22.54 |
| 1372 | 23.54 |
| 1373 | 24.54 |
| 1374 | 25.54 |
| 1375 | 26.54 |
| 1376 | 27.54 |
| 1377 | 28.54 |
| 1378 | 29.54 |
| 1379 | 30.54 |
| 1380 | 28.61 |
| 1381 | 26.33 |
| 1382 | 27.33 |
| 1383 | 28.33 |
| 1384 | 29.33 |
| 1385 | 30.33 |
| 1386 | 31.33 |
| 1387 | 32.33 |
| 1388 | 33.33 |
| 1389 | 34.33 |
| 1390 | 32.37 |
| 1391 | 33.37 |
| 1392 | 31.45 |
| 1393 | 28.91 |
| 1394 | 29.91 |
| 1395 | 30.91 |
| 1396 | 31.91 |
| 1397 | 32.91 |
| 1398 | 33.91 |
| 1399 | 34.91 |
| 1400 | 35.91 |
| 1401 | 36.91 |
| 1402 | 37.91 |
| 1403 | 35.21 |
| 1404 | 36.21 |
| 1405 | 37.21 |
| 1406 | 38.21 |
| 1407 | 39.21 |
| 1408 | 40.21 |
| 1409 | 37.49 |
| 1410 | 38.49 |
| 1411 | 39.49 |
| 1412 | 37.52 |
| 1413 | 38.52 |
| 1414 | 39.52 |
| 1415 | 37.27 |
| 1416 | 34.41 |
| 1417 | 35.41 |
| 1418 | 32.81 |
| 1419 | 33.81 |
| 1420 | 31.46 |
| 1421 | 32.46 |
| 1422 | 33.46 |
| 1423 | 34.46 |
| 1424 | 35.46 |
| 1425 | 30.88 |
| 1426 | 29.06 |
| 1427 | 30.06 |
| 1428 | 31.06 |
| 1429 | 28.37 |
| 1430 | 29.37 |
| 1431 | 27.36 |
| 1432 | 24.52 |
| 1433 | 20.99 |
| 1434 | 21.99 |
| 1435 | 18.76 |
| 1436 | 19.76 |
| 1437 | 20.76 |
| 1438 | 21.76 |
| 1439 | 22.76 |
| 1440 | 23.76 |
| 1441 | 24.76 |
| 1442 | 22.04 |
| 1443 | 23.04 |
| 1444 | 24.04 |
| 1445 | 25.04 |
| 1446 | 22.79 |
| 1447 | 20.54 |
| 1448 | 21.54 |
| 1449 | 22.54 |
| 1450 | 23.54 |
| 1451 | 24.54 |
| 1452 | 25.54 |
| 1453 | 26.54 |
| 1454 | 27.54 |
| 1455 | 28.54 |
| 1456 | 29.54 |
| 1457 | 30.54 |
| 1458 | 31.54 |
| 1459 | 27.91 |
| 1460 | 28.91 |
| 1461 | 24.99 |
| 1462 | 25.99 |
| 1463 | 26.99 |
| 1464 | 27.99 |
| 1465 | 28.99 |
| 1466 | 29.99 |
| 1467 | 30.99 |
| 1468 | 31.99 |
| 1469 | 32.99 |
| 1470 | 30.86 |
| 1471 | 31.86 |
| 1472 | 32.86 |
| 1473 | 33.86 |
| 1474 | 31.05 |
| 1475 | 32.05 |
| 1476 | 33.05 |
| 1477 | 34.05 |
| 1478 | 35.05 |
| 1479 | 36.05 |
| 1480 | 37.05 |
| 1481 | 38.05 |
| 1482 | 39.05 |
| 1483 | 37.22 |
| 1484 | 38.22 |
| 1485 | 36.37 |
| 1486 | 37.37 |
| 1487 | 38.37 |
| 1488 | 39.37 |
| 1489 | 40.37 |
| 1490 | 41.37 |
| 1491 | 42.37 |
| 1492 | 43.37 |
| 1493 | 41.55 |
| 1494 | 42.55 |
| 1495 | 43.55 |
| 1496 | 44.55 |
| 1497 | 45.55 |
| 1498 | 46.55 |
| 1499 | 47.55 |
| 1500 | 48.55 |
| 1501 | 46.68 |
| 1502 | 47.68 |
| 1503 | 45.96 |
| 1504 | 46.96 |
| 1505 | 44.95 |
| 1506 | 45.95 |
| 1507 | 43.65 |
| 1508 | 44.65 |
| 1509 | 45.65 |
| 1510 | 46.65 |
| 1511 | 47.65 |
| 1512 | 48.65 |
| 1513 | 44.17 |
| 1514 | 41.63 |
| 1515 | 42.63 |
| 1516 | 40.76 |
| 1517 | 41.76 |
| 1518 | 38.75 |
| 1519 | 36.12 |
| 1520 | 37.12 |
| 1521 | 38.12 |
| 1522 | 39.12 |
| 1523 | 40.12 |
| 1524 | 41.12 |
| 1525 | 42.12 |
| 1526 | 43.12 |
| 1527 | 44.12 |
| 1528 | 45.12 |
| 1529 | 46.12 |
| 1530 | 47.12 |
| 1531 | 45.21 |
| 1532 | 46.21 |
| 1533 | 47.21 |
| 1534 | 48.21 |
| 1535 | 49.21 |
| 1536 | 46.76 |
| 1537 | 47.76 |
| 1538 | 48.76 |
| 1539 | 49.76 |
| 1540 | 46.92 |
| 1541 | 47.92 |
| 1542 | 45.32 |
| 1543 | 43.1 |
| 1544 | 40.8 |
| 1545 | 41.8 |
| 1546 | 42.8 |
| 1547 | 43.8 |
| 1548 | 44.8 |
| 1549 | 42.84 |
| 1550 | 43.84 |
| 1551 | 44.84 |
| 1552 | 45.84 |
| 1553 | 46.84 |
| 1554 | 43.48 |
| 1555 | 41.53 |
| 1556 | 37.92 |
| 1557 | 38.92 |
| 1558 | 39.92 |
| 1559 | 40.92 |
| 1560 | 37.39 |
| 1561 | 38.39 |
| 1562 | 36.12 |
| 1563 | 37.12 |
| 1564 | 38.12 |
| 1565 | 39.12 |
| 1566 | 40.12 |
| 1567 | 41.12 |
| 1568 | 38.77 |
| 1569 | 39.77 |
| 1570 | 40.77 |
| 1571 | 38.31 |
| 1572 | 39.31 |
| 1573 | 40.31 |
| 1574 | 41.31 |
| 1575 | 42.31 |
| 1576 | 43.31 |
| 1577 | 44.31 |
| 1578 | 45.31 |
| 1579 | 46.31 |
| 1580 | 47.31 |
| 1581 | 48.31 |
| 1582 | 49.31 |
| 1583 | 47.01 |
| 1584 | 48.01 |
| 1585 | 44.49 |
| 1586 | 45.49 |
| 1587 | 46.49 |
| 1588 | 43.16 |
| 1589 | 44.16 |
| 1590 | 45.16 |
| 1591 | 46.16 |
| 1592 | 47.16 |
| 1593 | 48.16 |
| 1594 | 49.16 |
| 1595 | 47.51 |
| 1596 | 48.51 |
| 1597 | 45.21 |
| 1598 | 46.21 |
| 1599 | 41.9 |
| 1600 | 42.9 |
| 1601 | 39.05 |
| 1602 | 40.05 |
| 1603 | 37.94 |
| 1604 | 38.94 |
| 1605 | 34.73 |
| 1606 | 35.73 |
| 1607 | 36.73 |
| 1608 | 37.73 |
| 1609 | 32.89 |
| 1610 | 29.85 |
| 1611 | 30.85 |
| 1612 | 31.85 |
| 1613 | 32.85 |
| 1614 | 33.85 |
| 1615 | 34.85 |
| 1616 | 35.85 |
| 1617 | 36.85 |
| 1618 | 32.08 |
| 1619 | 33.08 |
| 1620 | 31.18 |
| 1621 | 32.18 |
| 1622 | 33.18 |
| 1623 | 34.18 |
| 1624 | 35.18 |
| 1625 | 32.69 |
| 1626 | 33.69 |
| 1627 | 34.69 |
| 1628 | 35.69 |
| 1629 | 36.69 |
| 1630 | 37.69 |
| 1631 | 38.69 |
| 1632 | 39.69 |
| 1633 | 37.72 |
| 1634 | 38.72 |
| 1635 | 39.72 |
| 1636 | 40.72 |
| 1637 | 41.72 |
| 1638 | 42.72 |
| 1639 | 43.72 |
| 1640 | 41.2 |
| 1641 | 42.2 |
| 1642 | 43.2 |
| 1643 | 44.2 |
| 1644 | 45.2 |
| 1645 | 42.64 |
| 1646 | 43.64 |
| 1647 | 44.64 |
| 1648 | 45.64 |
| 1649 | 46.64 |
| 1650 | 47.64 |
| 1651 | 48.64 |
| 1652 | 49.64 |
| 1653 | 50.64 |
| 1654 | 51.64 |
| 1655 | 52.64 |
| 1656 | 53.64 |
| 1657 | 50.75 |
| 1658 | 48.43 |
| 1659 | 49.43 |
| 1660 | 50.43 |
| 1661 | 48.23 |
| 1662 | 49.23 |
| 1663 | 50.23 |
| 1664 | 48.49 |
| 1665 | 49.49 |
| 1666 | 50.49 |
| 1667 | 51.49 |
| 1668 | 52.49 |
| 1669 | 53.49 |
| 1670 | 49.94 |
| 1671 | 47.88 |
| 1672 | 48.88 |
| 1673 | 49.88 |
| 1674 | 50.88 |
| 1675 | 51.88 |
| 1676 | 52.88 |
| 1677 | 53.88 |
| 1678 | 54.88 |
| 1679 | 55.88 |
| 1680 | 56.88 |
| 1681 | 53.35 |
| 1682 | 54.35 |
| 1683 | 55.35 |
| 1684 | 52.9 |
| 1685 | 53.9 |
| 1686 | 54.9 |
| 1687 | 52.49 |
| 1688 | 53.49 |
| 1689 | 54.49 |
| 1690 | 55.49 |
| 1691 | 56.49 |
| 1692 | 57.49 |
| 1693 | 55.5 |
| 1694 | 56.5 |
| 1695 | 54 |
| 1696 | 55 |
| 1697 | 56 |
| 1698 | 57 |
| 1699 | 58 |
| 1700 | 54.35 |
| 1701 | 55.35 |
| 1702 | 56.35 |
| 1703 | 57.35 |
| 1704 | 58.35 |
| 1705 | 55.46 |
| 1706 | 56.46 |
| 1707 | 57.46 |
| 1708 | 58.46 |
| 1709 | 59.46 |
| 1710 | 56.97 |
| 1711 | 57.97 |
| 1712 | 55.38 |
| 1713 | 52.54 |
| 1714 | 53.54 |
| 1715 | 54.54 |
| 1716 | 55.54 |
| 1717 | 56.54 |
| 1718 | 57.54 |
| 1719 | 58.54 |
| 1720 | 59.54 |
| 1721 | 60.54 |
| 1722 | 61.54 |
| 1723 | 62.54 |
| 1724 | 59.33 |
| 1725 | 60.33 |
| 1726 | 61.33 |
| 1727 | 57.21 |
| 1728 | 54.11 |
| 1729 | 55.11 |
| 1730 | 56.11 |
| 1731 | 53.61 |
| 1732 | 54.61 |
| 1733 | 55.61 |
| 1734 | 56.61 |
| 1735 | 54.39 |
| 1736 | 55.39 |
| 1737 | 56.39 |
| 1738 | 54.28 |
| 1739 | 51.03 |
| 1740 | 52.03 |
| 1741 | 53.03 |
| 1742 | 54.03 |
| 1743 | 51.38 |
| 1744 | 52.38 |
| 1745 | 53.38 |
| 1746 | 54.38 |
| 1747 | 55.38 |
| 1748 | 52.71 |
| 1749 | 53.71 |
| 1750 | 54.71 |
| 1751 | 55.71 |
| 1752 | 56.71 |
| 1753 | 54.17 |
| 1754 | 55.17 |
| 1755 | 56.17 |
| 1756 | 53.48 |
| 1757 | 50.04 |
| 1758 | 51.04 |
| 1759 | 52.04 |
| 1760 | 49.54 |
| 1761 | 45.03 |
| 1762 | 41.8 |
| 1763 | 42.8 |
| 1764 | 43.8 |
| 1765 | 41.64 |
| 1766 | 42.64 |
| 1767 | 43.64 |
| 1768 | 41.01 |
| 1769 | 42.01 |
| 1770 | 43.01 |
| 1771 | 39.43 |
| 1772 | 40.43 |
| 1773 | 37.2 |
| 1774 | 38.2 |
| 1775 | 39.2 |
| 1776 | 36.65 |
| 1777 | 37.65 |
| 1778 | 38.65 |
| 1779 | 39.65 |
| 1780 | 40.65 |
| 1781 | 41.65 |
| 1782 | 42.65 |
| 1783 | 43.65 |
| 1784 | 41.09 |
| 1785 | 42.09 |
| 1786 | 43.09 |
| 1787 | 40.93 |
| 1788 | 41.93 |
| 1789 | 42.93 |
| 1790 | 38.89 |
| 1791 | 36.41 |
| 1792 | 37.41 |
| 1793 | 38.41 |
| 1794 | 39.41 |
| 1795 | 40.41 |
| 1796 | 41.41 |
| 1797 | 42.41 |
| 1798 | 43.41 |
| 1799 | 40.75 |
| 1800 | 37.98 |
| 1801 | 38.98 |
| 1802 | 39.98 |
| 1803 | 36.65 |
| 1804 | 37.65 |
| 1805 | 38.65 |
| 1806 | 39.65 |
| 1807 | 37.03 |
| 1808 | 33.72 |
| 1809 | 31.14 |
| 1810 | 28.87 |
| 1811 | 26.62 |
| 1812 | 27.62 |
| 1813 | 28.62 |
| 1814 | 29.62 |
| 1815 | 30.62 |
| 1816 | 31.62 |
| 1817 | 32.62 |
| 1818 | 29.83 |
| 1819 | 30.83 |
| 1820 | 31.83 |
| 1821 | 32.83 |
| 1822 | 33.83 |
| 1823 | 34.83 |
| 1824 | 35.83 |
| 1825 | 36.83 |
| 1826 | 37.83 |
| 1827 | 38.83 |
| 1828 | 39.83 |
| 1829 | 40.83 |
| 1830 | 41.83 |
| 1831 | 39.58 |
| 1832 | 40.58 |
| 1833 | 41.58 |
| 1834 | 42.58 |
| 1835 | 43.58 |
| 1836 | 44.58 |
| 1837 | 45.58 |
| 1838 | 46.58 |
| 1839 | 47.58 |
| 1840 | 48.58 |
| 1841 | 46.39 |
| 1842 | 47.39 |
| 1843 | 48.39 |
| 1844 | 45.93 |
| 1845 | 46.93 |
| 1846 | 47.93 |
| 1847 | 48.93 |
| 1848 | 49.93 |
| 1849 | 50.93 |
| 1850 | 51.93 |
| 1851 | 49.43 |
| 1852 | 50.43 |
| 1853 | 48.47 |
| 1854 | 45.63 |
| 1855 | 46.63 |
| 1856 | 47.63 |
| 1857 | 45.17 |
| 1858 | 46.17 |
| 1859 | 47.17 |
| 1860 | 48.17 |
| 1861 | 49.17 |
| 1862 | 50.17 |
| 1863 | 51.17 |
| 1864 | 52.17 |
| 1865 | 53.17 |
| 1866 | 54.17 |
| 1867 | 50.45 |
| 1868 | 51.45 |
| 1869 | 52.45 |
| 1870 | 53.45 |
| 1871 | 54.45 |
| 1872 | 50.92 |
| 1873 | 48.02 |
| 1874 | 49.02 |
| 1875 | 50.02 |
| 1876 | 51.02 |
| 1877 | 52.02 |
| 1878 | 53.02 |
| 1879 | 54.02 |
| 1880 | 55.02 |
| 1881 | 56.02 |
| 1882 | 54.07 |
| 1883 | 55.07 |
| 1884 | 52.23 |
| 1885 | 49.09 |
| 1886 | 50.09 |
| 1887 | 51.09 |
| 1888 | 52.09 |
| 1889 | 53.09 |
| 1890 | 54.09 |
| 1891 | 51.9 |
| 1892 | 52.9 |
| 1893 | 53.9 |
| 1894 | 54.9 |
| 1895 | 55.9 |
| 1896 | 56.9 |
| 1897 | 57.9 |
| 1898 | 58.9 |
| 1899 | 59.9 |
| 1900 | 60.9 |
| 1901 | 61.9 |
| 1902 | 62.9 |
| 1903 | 63.9 |
| 1904 | 59.18 |
| 1905 | 60.18 |
| 1906 | 58.09 |
| 1907 | 59.09 |
| 1908 | 55.76 |
| 1909 | 52.33 |
| 1910 | 50.26 |
| 1911 | 47.19 |
| 1912 | 48.19 |
| 1913 | 45.8 |
| 1914 | 43.29 |
| 1915 | 40.69 |
| 1916 | 41.69 |
| 1917 | 39.54 |
| 1918 | 40.54 |
| 1919 | 41.54 |
| 1920 | 42.54 |
| 1921 | 43.54 |
| 1922 | 44.54 |
| 1923 | 41.62 |
| 1924 | 42.62 |
| 1925 | 43.62 |
| 1926 | 44.62 |
| 1927 | 45.62 |
| 1928 | 46.62 |
| 1929 | 47.62 |
| 1930 | 48.62 |
| 1931 | 46.66 |
| 1932 | 47.66 |
| 1933 | 48.66 |
| 1934 | 49.66 |
| 1935 | 50.66 |
| 1936 | 51.66 |
| 1937 | 52.66 |
| 1938 | 53.66 |
| 1939 | 50.51 |
| 1940 | 51.51 |
| 1941 | 47.9 |
| 1942 | 48.9 |
| 1943 | 49.9 |
| 1944 | 50.9 |
| 1945 | 48.49 |
| 1946 | 49.49 |
| 1947 | 50.49 |
| 1948 | 51.49 |
| 1949 | 52.49 |
| 1950 | 49.7 |
| 1951 | 50.7 |
| 1952 | 51.7 |
| 1953 | 52.7 |
| 1954 | 53.7 |
| 1955 | 54.7 |
| 1956 | 55.7 |
| 1957 | 56.7 |
| 1958 | 52.46 |
| 1959 | 53.46 |
| 1960 | 54.46 |
| 1961 | 52.21 |
| 1962 | 53.21 |
| 1963 | 54.21 |
| 1964 | 55.21 |
| 1965 | 49.99 |
| 1966 | 50.99 |
| 1967 | 51.99 |
| 1968 | 52.99 |
| 1969 | 50.79 |
| 1970 | 51.79 |
| 1971 | 52.79 |
| 1972 | 53.79 |
| 1973 | 54.79 |
| 1974 | 55.79 |
| 1975 | 53.36 |
| 1976 | 54.36 |
| 1977 | 55.36 |
| 1978 | 51.15 |
| 1979 | 52.15 |
| 1980 | 53.15 |
| 1981 | 54.15 |
| 1982 | 55.15 |
| 1983 | 56.15 |
| 1984 | 57.15 |
| 1985 | 58.15 |
| 1986 | 59.15 |
| 1987 | 60.15 |
| 1988 | 61.15 |
| 1989 | 62.15 |
| 1990 | 63.15 |
| 1991 | 61.04 |
| 1992 | 62.04 |
| 1993 | 63.04 |
| 1994 | 64.04 |
| 1995 | 65.05 |
| 1996 | 66.05 |
| 1997 | 63.55 |
| 1998 | 61.72 |
| 1999 | 59.42 |
| 2000 | 60.42 |
| 2001 | 61.42 |
| 2002 | 62.42 |
| 2003 | 60.03 |
| 2004 | 57.56 |
| 2005 | 58.56 |
| 2006 | 55.52 |
| 2007 | 52.85 |
| 2008 | 50.54 |
| 2009 | 51.54 |
| 2010 | 52.54 |
| 2011 | 50.24 |
| 2012 | 47.51 |
| 2013 | 48.51 |
| 2014 | 49.51 |
| 2015 | 50.51 |
| 2016 | 51.51 |
| 2017 | 52.51 |
| 2018 | 49.3 |